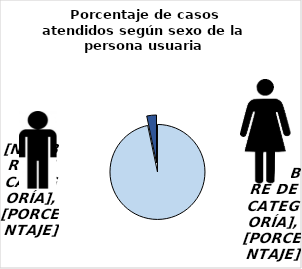
| Category | Series 0 |
|---|---|
| Mujer | 0.967 |
| Hombre | 0.033 |